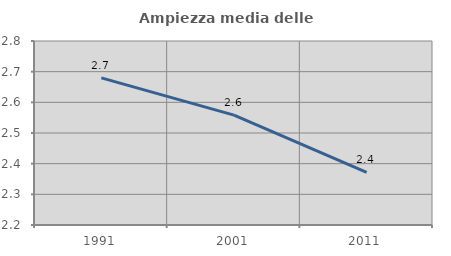
| Category | Ampiezza media delle famiglie |
|---|---|
| 1991.0 | 2.68 |
| 2001.0 | 2.558 |
| 2011.0 | 2.372 |